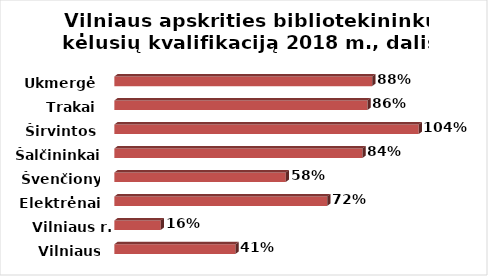
| Category | Series 0 |
|---|---|
| Vilniaus m. | 0.412 |
| Vilniaus r. | 0.158 |
| Elektrėnai | 0.724 |
| Švenčionys | 0.583 |
| Šalčininkai | 0.844 |
| Širvintos | 1.036 |
| Trakai | 0.861 |
| Ukmergė | 0.878 |